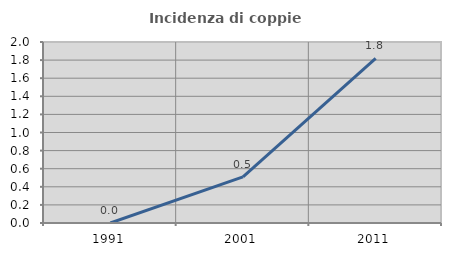
| Category | Incidenza di coppie miste |
|---|---|
| 1991.0 | 0 |
| 2001.0 | 0.509 |
| 2011.0 | 1.819 |